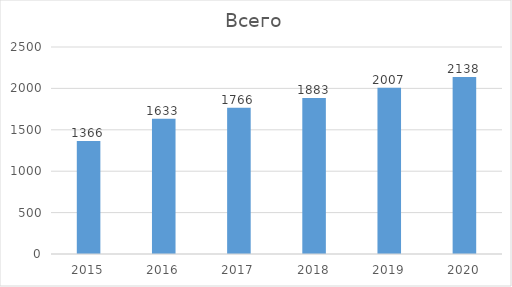
| Category | Всего |
|---|---|
| 2015.0 | 1366 |
| 2016.0 | 1633 |
| 2017.0 | 1766 |
| 2018.0 | 1883 |
| 2019.0 | 2007 |
| 2020.0 | 2138 |